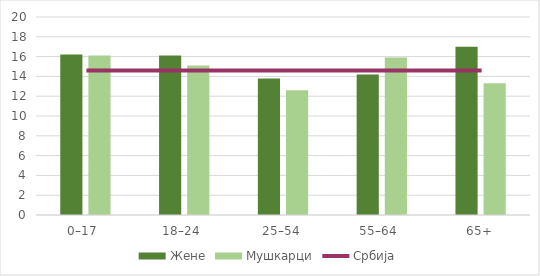
| Category | Жене | Мушкарци |
|---|---|---|
| 0–17  | 16.2 | 16.1 |
| 18–24  | 16.1 | 15.1 |
| 25–54 | 13.8 | 12.6 |
| 55–64  | 14.2 | 15.9 |
| 65+ | 17 | 13.3 |